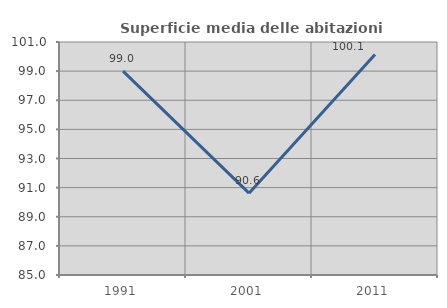
| Category | Superficie media delle abitazioni occupate |
|---|---|
| 1991.0 | 98.997 |
| 2001.0 | 90.619 |
| 2011.0 | 100.14 |